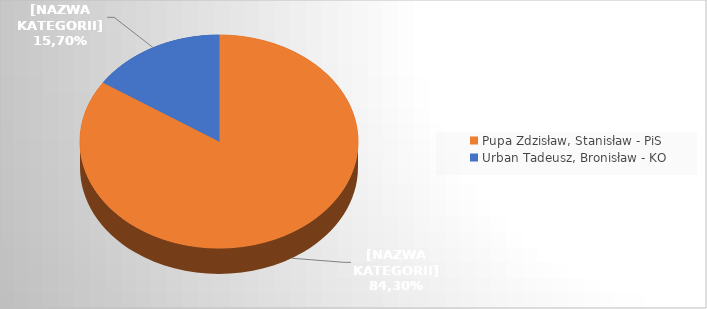
| Category | Series 0 |
|---|---|
| Pupa Zdzisław, Stanisław - PiS | 0.843 |
| Urban Tadeusz, Bronisław - KO | 0.157 |